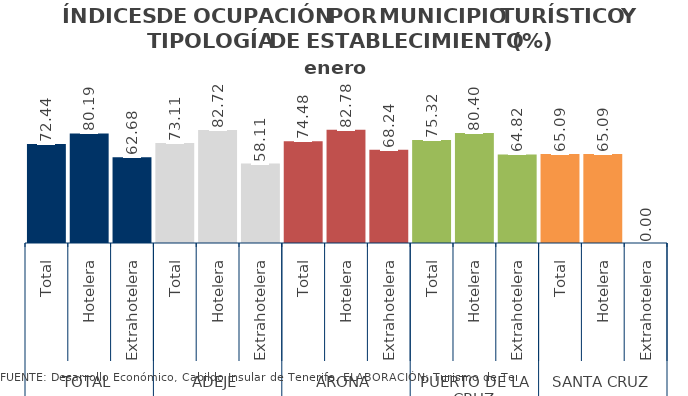
| Category | acum. febrero 2014 |
|---|---|
| 0 | 72.443 |
| 1 | 80.185 |
| 2 | 62.684 |
| 3 | 73.111 |
| 4 | 82.72 |
| 5 | 58.111 |
| 6 | 74.479 |
| 7 | 82.776 |
| 8 | 68.242 |
| 9 | 75.318 |
| 10 | 80.401 |
| 11 | 64.824 |
| 12 | 65.094 |
| 13 | 65.094 |
| 14 | 0 |